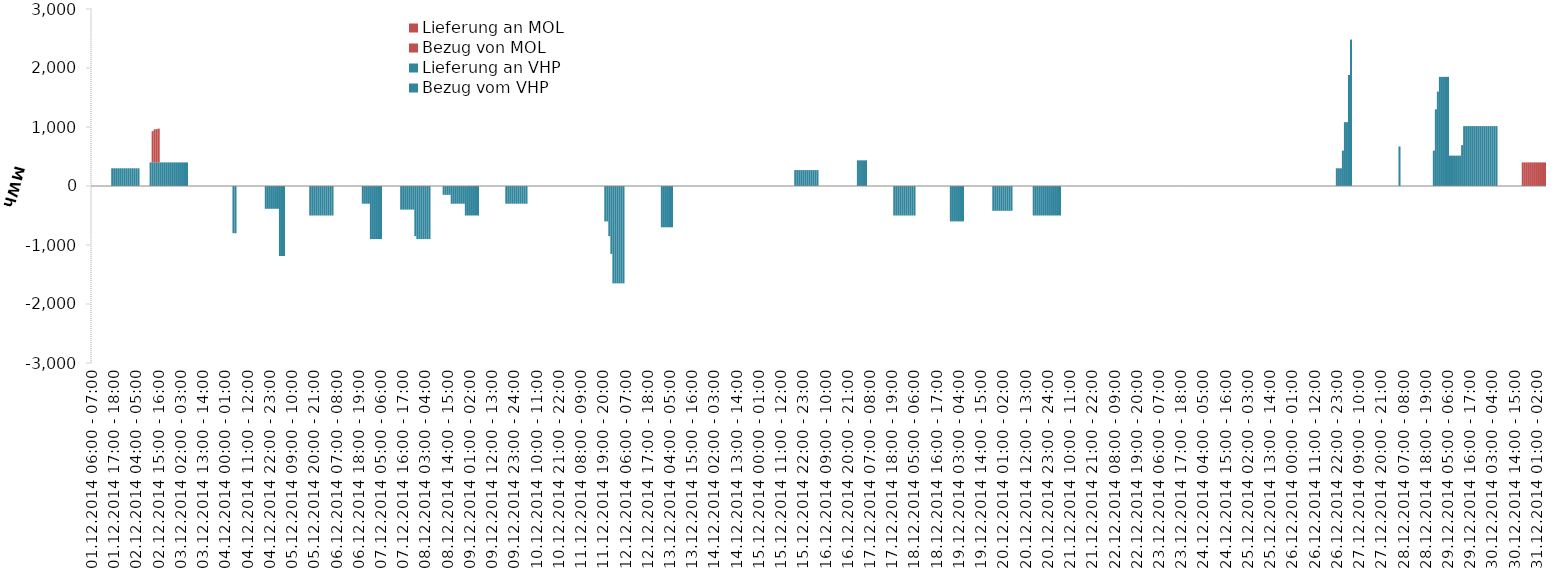
| Category | Bezug vom VHP | Lieferung an VHP | Bezug von MOL | Lieferung an MOL |
|---|---|---|---|---|
| 01.12.2014 06:00 - 07:00 | 0 | 0 | 0 | 0 |
| 01.12.2014 07:00 - 08:00 | 0 | 0 | 0 | 0 |
| 01.12.2014 08:00 - 09:00 | 0 | 0 | 0 | 0 |
| 01.12.2014 09:00 - 10:00 | 0 | 0 | 0 | 0 |
| 01.12.2014 10:00 - 11:00 | 0 | 0 | 0 | 0 |
| 01.12.2014 11:00 - 12:00 | 0 | 0 | 0 | 0 |
| 01.12.2014 12:00 - 13:00 | 0 | 0 | 0 | 0 |
| 01.12.2014 13:00 - 14:00 | 0 | 0 | 0 | 0 |
| 01.12.2014 14:00 - 15:00 | 0 | 0 | 0 | 0 |
| 01.12.2014 15:00 - 16:00 | 0 | 0 | 0 | 0 |
| 01.12.2014 16:00 - 17:00 | 300 | 0 | 0 | 0 |
| 01.12.2014 17:00 - 18:00 | 300 | 0 | 0 | 0 |
| 01.12.2014 18:00 - 19:00 | 300 | 0 | 0 | 0 |
| 01.12.2014 19:00 - 20:00 | 300 | 0 | 0 | 0 |
| 01.12.2014 20:00 - 21:00 | 300 | 0 | 0 | 0 |
| 01.12.2014 21:00 - 22:00 | 300 | 0 | 0 | 0 |
| 01.12.2014 22:00 - 23:00 | 300 | 0 | 0 | 0 |
| 01.12.2014 23:00 - 24:00 | 300 | 0 | 0 | 0 |
| 02.12.2014 00:00 - 01:00 | 300 | 0 | 0 | 0 |
| 02.12.2014 01:00 - 02:00 | 300 | 0 | 0 | 0 |
| 02.12.2014 02:00 - 03:00 | 300 | 0 | 0 | 0 |
| 02.12.2014 03:00 - 04:00 | 300 | 0 | 0 | 0 |
| 02.12.2014 04:00 - 05:00 | 300 | 0 | 0 | 0 |
| 02.12.2014 05:00 - 06:00 | 300 | 0 | 0 | 0 |
| 02.12.2014 06:00 - 07:00 | 0 | 0 | 0 | 0 |
| 02.12.2014 07:00 - 08:00 | 0 | 0 | 0 | 0 |
| 02.12.2014 08:00 - 09:00 | 0 | 0 | 0 | 0 |
| 02.12.2014 09:00 - 10:00 | 0 | 0 | 0 | 0 |
| 02.12.2014 10:00 - 11:00 | 0 | 0 | 0 | 0 |
| 02.12.2014 11:00 - 12:00 | 400 | 0 | 0 | 0 |
| 02.12.2014 12:00 - 13:00 | 400 | 0 | 530 | 0 |
| 02.12.2014 13:00 - 14:00 | 400 | 0 | 560 | 0 |
| 02.12.2014 14:00 - 15:00 | 400 | 0 | 565 | 0 |
| 02.12.2014 15:00 - 16:00 | 400 | 0 | 573 | 0 |
| 02.12.2014 16:00 - 17:00 | 400 | 0 | 0 | 0 |
| 02.12.2014 17:00 - 18:00 | 400 | 0 | 0 | 0 |
| 02.12.2014 18:00 - 19:00 | 400 | 0 | 0 | 0 |
| 02.12.2014 19:00 - 20:00 | 400 | 0 | 0 | 0 |
| 02.12.2014 20:00 - 21:00 | 400 | 0 | 0 | 0 |
| 02.12.2014 21:00 - 22:00 | 400 | 0 | 0 | 0 |
| 02.12.2014 22:00 - 23:00 | 400 | 0 | 0 | 0 |
| 02.12.2014 23:00 - 24:00 | 400 | 0 | 0 | 0 |
| 03.12.2014 00:00 - 01:00 | 400 | 0 | 0 | 0 |
| 03.12.2014 01:00 - 02:00 | 400 | 0 | 0 | 0 |
| 03.12.2014 02:00 - 03:00 | 400 | 0 | 0 | 0 |
| 03.12.2014 03:00 - 04:00 | 400 | 0 | 0 | 0 |
| 03.12.2014 04:00 - 05:00 | 400 | 0 | 0 | 0 |
| 03.12.2014 05:00 - 06:00 | 400 | 0 | 0 | 0 |
| 03.12.2014 06:00 - 07:00 | 0 | 0 | 0 | 0 |
| 03.12.2014 07:00 - 08:00 | 0 | 0 | 0 | 0 |
| 03.12.2014 08:00 - 09:00 | 0 | 0 | 0 | 0 |
| 03.12.2014 09:00 - 10:00 | 0 | 0 | 0 | 0 |
| 03.12.2014 10:00 - 11:00 | 0 | 0 | 0 | 0 |
| 03.12.2014 11:00 - 12:00 | 0 | 0 | 0 | 0 |
| 03.12.2014 12:00 - 13:00 | 0 | 0 | 0 | 0 |
| 03.12.2014 13:00 - 14:00 | 0 | 0 | 0 | 0 |
| 03.12.2014 14:00 - 15:00 | 0 | 0 | 0 | 0 |
| 03.12.2014 15:00 - 16:00 | 0 | 0 | 0 | 0 |
| 03.12.2014 16:00 - 17:00 | 0 | 0 | 0 | 0 |
| 03.12.2014 17:00 - 18:00 | 0 | 0 | 0 | 0 |
| 03.12.2014 18:00 - 19:00 | 0 | 0 | 0 | 0 |
| 03.12.2014 19:00 - 20:00 | 0 | 0 | 0 | 0 |
| 03.12.2014 20:00 - 21:00 | 0 | 0 | 0 | 0 |
| 03.12.2014 21:00 - 22:00 | 0 | 0 | 0 | 0 |
| 03.12.2014 22:00 - 23:00 | 0 | 0 | 0 | 0 |
| 03.12.2014 23:00 - 24:00 | 0 | 0 | 0 | 0 |
| 04.12.2014 00:00 - 01:00 | 0 | 0 | 0 | 0 |
| 04.12.2014 01:00 - 02:00 | 0 | 0 | 0 | 0 |
| 04.12.2014 02:00 - 03:00 | 0 | 0 | 0 | 0 |
| 04.12.2014 03:00 - 04:00 | 0 | 0 | 0 | 0 |
| 04.12.2014 04:00 - 05:00 | 0 | -800 | 0 | 0 |
| 04.12.2014 05:00 - 06:00 | 0 | -800 | 0 | 0 |
| 04.12.2014 06:00 - 07:00 | 0 | 0 | 0 | 0 |
| 04.12.2014 07:00 - 08:00 | 0 | 0 | 0 | 0 |
| 04.12.2014 08:00 - 09:00 | 0 | 0 | 0 | 0 |
| 04.12.2014 09:00 - 10:00 | 0 | 0 | 0 | 0 |
| 04.12.2014 10:00 - 11:00 | 0 | 0 | 0 | 0 |
| 04.12.2014 11:00 - 12:00 | 0 | 0 | 0 | 0 |
| 04.12.2014 12:00 - 13:00 | 0 | 0 | 0 | 0 |
| 04.12.2014 13:00 - 14:00 | 0 | 0 | 0 | 0 |
| 04.12.2014 14:00 - 15:00 | 0 | 0 | 0 | 0 |
| 04.12.2014 15:00 - 16:00 | 0 | 0 | 0 | 0 |
| 04.12.2014 16:00 - 17:00 | 0 | 0 | 0 | 0 |
| 04.12.2014 17:00 - 18:00 | 0 | 0 | 0 | 0 |
| 04.12.2014 18:00 - 19:00 | 0 | 0 | 0 | 0 |
| 04.12.2014 19:00 - 20:00 | 0 | 0 | 0 | 0 |
| 04.12.2014 20:00 - 21:00 | 0 | -386 | 0 | 0 |
| 04.12.2014 21:00 - 22:00 | 0 | -386 | 0 | 0 |
| 04.12.2014 22:00 - 23:00 | 0 | -386 | 0 | 0 |
| 04.12.2014 23:00 - 24:00 | 0 | -386 | 0 | 0 |
| 05.12.2014 00:00 - 01:00 | 0 | -386 | 0 | 0 |
| 05.12.2014 01:00 - 02:00 | 0 | -386 | 0 | 0 |
| 05.12.2014 02:00 - 03:00 | 0 | -386 | 0 | 0 |
| 05.12.2014 03:00 - 04:00 | 0 | -1186 | 0 | 0 |
| 05.12.2014 04:00 - 05:00 | 0 | -1186 | 0 | 0 |
| 05.12.2014 05:00 - 06:00 | 0 | -1186 | 0 | 0 |
| 05.12.2014 06:00 - 07:00 | 0 | 0 | 0 | 0 |
| 05.12.2014 07:00 - 08:00 | 0 | 0 | 0 | 0 |
| 05.12.2014 08:00 - 09:00 | 0 | 0 | 0 | 0 |
| 05.12.2014 09:00 - 10:00 | 0 | 0 | 0 | 0 |
| 05.12.2014 10:00 - 11:00 | 0 | 0 | 0 | 0 |
| 05.12.2014 11:00 - 12:00 | 0 | 0 | 0 | 0 |
| 05.12.2014 12:00 - 13:00 | 0 | 0 | 0 | 0 |
| 05.12.2014 13:00 - 14:00 | 0 | 0 | 0 | 0 |
| 05.12.2014 14:00 - 15:00 | 0 | 0 | 0 | 0 |
| 05.12.2014 15:00 - 16:00 | 0 | 0 | 0 | 0 |
| 05.12.2014 16:00 - 17:00 | 0 | 0 | 0 | 0 |
| 05.12.2014 17:00 - 18:00 | 0 | 0 | 0 | 0 |
| 05.12.2014 18:00 - 19:00 | 0 | -500 | 0 | 0 |
| 05.12.2014 19:00 - 20:00 | 0 | -500 | 0 | 0 |
| 05.12.2014 20:00 - 21:00 | 0 | -500 | 0 | 0 |
| 05.12.2014 21:00 - 22:00 | 0 | -500 | 0 | 0 |
| 05.12.2014 22:00 - 23:00 | 0 | -500 | 0 | 0 |
| 05.12.2014 23:00 - 24:00 | 0 | -500 | 0 | 0 |
| 06.12.2014 00:00 - 01:00 | 0 | -500 | 0 | 0 |
| 06.12.2014 01:00 - 02:00 | 0 | -500 | 0 | 0 |
| 06.12.2014 02:00 - 03:00 | 0 | -500 | 0 | 0 |
| 06.12.2014 03:00 - 04:00 | 0 | -500 | 0 | 0 |
| 06.12.2014 04:00 - 05:00 | 0 | -500 | 0 | 0 |
| 06.12.2014 05:00 - 06:00 | 0 | -500 | 0 | 0 |
| 06.12.2014 06:00 - 07:00 | 0 | 0 | 0 | 0 |
| 06.12.2014 07:00 - 08:00 | 0 | 0 | 0 | 0 |
| 06.12.2014 08:00 - 09:00 | 0 | 0 | 0 | 0 |
| 06.12.2014 09:00 - 10:00 | 0 | 0 | 0 | 0 |
| 06.12.2014 10:00 - 11:00 | 0 | 0 | 0 | 0 |
| 06.12.2014 11:00 - 12:00 | 0 | 0 | 0 | 0 |
| 06.12.2014 12:00 - 13:00 | 0 | 0 | 0 | 0 |
| 06.12.2014 13:00 - 14:00 | 0 | 0 | 0 | 0 |
| 06.12.2014 14:00 - 15:00 | 0 | 0 | 0 | 0 |
| 06.12.2014 15:00 - 16:00 | 0 | 0 | 0 | 0 |
| 06.12.2014 16:00 - 17:00 | 0 | 0 | 0 | 0 |
| 06.12.2014 17:00 - 18:00 | 0 | 0 | 0 | 0 |
| 06.12.2014 18:00 - 19:00 | 0 | 0 | 0 | 0 |
| 06.12.2014 19:00 - 20:00 | 0 | 0 | 0 | 0 |
| 06.12.2014 20:00 - 21:00 | 0 | -300 | 0 | 0 |
| 06.12.2014 21:00 - 22:00 | 0 | -300 | 0 | 0 |
| 06.12.2014 22:00 - 23:00 | 0 | -300 | 0 | 0 |
| 06.12.2014 23:00 - 24:00 | 0 | -300 | 0 | 0 |
| 07.12.2014 00:00 - 01:00 | 0 | -900 | 0 | 0 |
| 07.12.2014 01:00 - 02:00 | 0 | -900 | 0 | 0 |
| 07.12.2014 02:00 - 03:00 | 0 | -900 | 0 | 0 |
| 07.12.2014 03:00 - 04:00 | 0 | -900 | 0 | 0 |
| 07.12.2014 04:00 - 05:00 | 0 | -900 | 0 | 0 |
| 07.12.2014 05:00 - 06:00 | 0 | -900 | 0 | 0 |
| 07.12.2014 06:00 - 07:00 | 0 | 0 | 0 | 0 |
| 07.12.2014 07:00 - 08:00 | 0 | 0 | 0 | 0 |
| 07.12.2014 08:00 - 09:00 | 0 | 0 | 0 | 0 |
| 07.12.2014 09:00 - 10:00 | 0 | 0 | 0 | 0 |
| 07.12.2014 10:00 - 11:00 | 0 | 0 | 0 | 0 |
| 07.12.2014 11:00 - 12:00 | 0 | 0 | 0 | 0 |
| 07.12.2014 12:00 - 13:00 | 0 | 0 | 0 | 0 |
| 07.12.2014 13:00 - 14:00 | 0 | 0 | 0 | 0 |
| 07.12.2014 14:00 - 15:00 | 0 | 0 | 0 | 0 |
| 07.12.2014 15:00 - 16:00 | 0 | -400 | 0 | 0 |
| 07.12.2014 16:00 - 17:00 | 0 | -400 | 0 | 0 |
| 07.12.2014 17:00 - 18:00 | 0 | -400 | 0 | 0 |
| 07.12.2014 18:00 - 19:00 | 0 | -400 | 0 | 0 |
| 07.12.2014 19:00 - 20:00 | 0 | -400 | 0 | 0 |
| 07.12.2014 20:00 - 21:00 | 0 | -400 | 0 | 0 |
| 07.12.2014 21:00 - 22:00 | 0 | -400 | 0 | 0 |
| 07.12.2014 22:00 - 23:00 | 0 | -850 | 0 | 0 |
| 07.12.2014 23:00 - 24:00 | 0 | -900 | 0 | 0 |
| 08.12.2014 00:00 - 01:00 | 0 | -900 | 0 | 0 |
| 08.12.2014 01:00 - 02:00 | 0 | -900 | 0 | 0 |
| 08.12.2014 02:00 - 03:00 | 0 | -900 | 0 | 0 |
| 08.12.2014 03:00 - 04:00 | 0 | -900 | 0 | 0 |
| 08.12.2014 04:00 - 05:00 | 0 | -900 | 0 | 0 |
| 08.12.2014 05:00 - 06:00 | 0 | -900 | 0 | 0 |
| 08.12.2014 06:00 - 07:00 | 0 | 0 | 0 | 0 |
| 08.12.2014 07:00 - 08:00 | 0 | 0 | 0 | 0 |
| 08.12.2014 08:00 - 09:00 | 0 | 0 | 0 | 0 |
| 08.12.2014 09:00 - 10:00 | 0 | 0 | 0 | 0 |
| 08.12.2014 10:00 - 11:00 | 0 | 0 | 0 | 0 |
| 08.12.2014 11:00 - 12:00 | 0 | 0 | 0 | 0 |
| 08.12.2014 12:00 - 13:00 | 0 | -150 | 0 | 0 |
| 08.12.2014 13:00 - 14:00 | 0 | -150 | 0 | 0 |
| 08.12.2014 14:00 - 15:00 | 0 | -150 | 0 | 0 |
| 08.12.2014 15:00 - 16:00 | 0 | -150 | 0 | 0 |
| 08.12.2014 16:00 - 17:00 | 0 | -300 | 0 | 0 |
| 08.12.2014 17:00 - 18:00 | 0 | -300 | 0 | 0 |
| 08.12.2014 18:00 - 19:00 | 0 | -300 | 0 | 0 |
| 08.12.2014 19:00 - 20:00 | 0 | -300 | 0 | 0 |
| 08.12.2014 20:00 - 21:00 | 0 | -300 | 0 | 0 |
| 08.12.2014 21:00 - 22:00 | 0 | -300 | 0 | 0 |
| 08.12.2014 22:00 - 23:00 | 0 | -300 | 0 | 0 |
| 08.12.2014 23:00 - 24:00 | 0 | -500 | 0 | 0 |
| 09.12.2014 00:00 - 01:00 | 0 | -500 | 0 | 0 |
| 09.12.2014 01:00 - 02:00 | 0 | -500 | 0 | 0 |
| 09.12.2014 02:00 - 03:00 | 0 | -500 | 0 | 0 |
| 09.12.2014 03:00 - 04:00 | 0 | -500 | 0 | 0 |
| 09.12.2014 04:00 - 05:00 | 0 | -500 | 0 | 0 |
| 09.12.2014 05:00 - 06:00 | 0 | -500 | 0 | 0 |
| 09.12.2014 06:00 - 07:00 | 0 | 0 | 0 | 0 |
| 09.12.2014 07:00 - 08:00 | 0 | 0 | 0 | 0 |
| 09.12.2014 08:00 - 09:00 | 0 | 0 | 0 | 0 |
| 09.12.2014 09:00 - 10:00 | 0 | 0 | 0 | 0 |
| 09.12.2014 10:00 - 11:00 | 0 | 0 | 0 | 0 |
| 09.12.2014 11:00 - 12:00 | 0 | 0 | 0 | 0 |
| 09.12.2014 12:00 - 13:00 | 0 | 0 | 0 | 0 |
| 09.12.2014 13:00 - 14:00 | 0 | 0 | 0 | 0 |
| 09.12.2014 14:00 - 15:00 | 0 | 0 | 0 | 0 |
| 09.12.2014 15:00 - 16:00 | 0 | 0 | 0 | 0 |
| 09.12.2014 16:00 - 17:00 | 0 | 0 | 0 | 0 |
| 09.12.2014 17:00 - 18:00 | 0 | 0 | 0 | 0 |
| 09.12.2014 18:00 - 19:00 | 0 | 0 | 0 | 0 |
| 09.12.2014 19:00 - 20:00 | 0 | -300 | 0 | 0 |
| 09.12.2014 20:00 - 21:00 | 0 | -300 | 0 | 0 |
| 09.12.2014 21:00 - 22:00 | 0 | -300 | 0 | 0 |
| 09.12.2014 22:00 - 23:00 | 0 | -300 | 0 | 0 |
| 09.12.2014 23:00 - 24:00 | 0 | -300 | 0 | 0 |
| 10.12.2014 00:00 - 01:00 | 0 | -300 | 0 | 0 |
| 10.12.2014 01:00 - 02:00 | 0 | -300 | 0 | 0 |
| 10.12.2014 02:00 - 03:00 | 0 | -300 | 0 | 0 |
| 10.12.2014 03:00 - 04:00 | 0 | -300 | 0 | 0 |
| 10.12.2014 04:00 - 05:00 | 0 | -300 | 0 | 0 |
| 10.12.2014 05:00 - 06:00 | 0 | -300 | 0 | 0 |
| 10.12.2014 06:00 - 07:00 | 0 | 0 | 0 | 0 |
| 10.12.2014 07:00 - 08:00 | 0 | 0 | 0 | 0 |
| 10.12.2014 08:00 - 09:00 | 0 | 0 | 0 | 0 |
| 10.12.2014 09:00 - 10:00 | 0 | 0 | 0 | 0 |
| 10.12.2014 10:00 - 11:00 | 0 | 0 | 0 | 0 |
| 10.12.2014 11:00 - 12:00 | 0 | 0 | 0 | 0 |
| 10.12.2014 12:00 - 13:00 | 0 | 0 | 0 | 0 |
| 10.12.2014 13:00 - 14:00 | 0 | 0 | 0 | 0 |
| 10.12.2014 14:00 - 15:00 | 0 | 0 | 0 | 0 |
| 10.12.2014 15:00 - 16:00 | 0 | 0 | 0 | 0 |
| 10.12.2014 16:00 - 17:00 | 0 | 0 | 0 | 0 |
| 10.12.2014 17:00 - 18:00 | 0 | 0 | 0 | 0 |
| 10.12.2014 18:00 - 19:00 | 0 | 0 | 0 | 0 |
| 10.12.2014 19:00 - 20:00 | 0 | 0 | 0 | 0 |
| 10.12.2014 20:00 - 21:00 | 0 | 0 | 0 | 0 |
| 10.12.2014 21:00 - 22:00 | 0 | 0 | 0 | 0 |
| 10.12.2014 22:00 - 23:00 | 0 | 0 | 0 | 0 |
| 10.12.2014 23:00 - 24:00 | 0 | 0 | 0 | 0 |
| 11.12.2014 00:00 - 01:00 | 0 | 0 | 0 | 0 |
| 11.12.2014 01:00 - 02:00 | 0 | 0 | 0 | 0 |
| 11.12.2014 02:00 - 03:00 | 0 | 0 | 0 | 0 |
| 11.12.2014 03:00 - 04:00 | 0 | 0 | 0 | 0 |
| 11.12.2014 04:00 - 05:00 | 0 | 0 | 0 | 0 |
| 11.12.2014 05:00 - 06:00 | 0 | 0 | 0 | 0 |
| 11.12.2014 06:00 - 07:00 | 0 | 0 | 0 | 0 |
| 11.12.2014 07:00 - 08:00 | 0 | 0 | 0 | 0 |
| 11.12.2014 08:00 - 09:00 | 0 | 0 | 0 | 0 |
| 11.12.2014 09:00 - 10:00 | 0 | 0 | 0 | 0 |
| 11.12.2014 10:00 - 11:00 | 0 | 0 | 0 | 0 |
| 11.12.2014 11:00 - 12:00 | 0 | 0 | 0 | 0 |
| 11.12.2014 12:00 - 13:00 | 0 | 0 | 0 | 0 |
| 11.12.2014 13:00 - 14:00 | 0 | 0 | 0 | 0 |
| 11.12.2014 14:00 - 15:00 | 0 | 0 | 0 | 0 |
| 11.12.2014 15:00 - 16:00 | 0 | 0 | 0 | 0 |
| 11.12.2014 16:00 - 17:00 | 0 | 0 | 0 | 0 |
| 11.12.2014 17:00 - 18:00 | 0 | 0 | 0 | 0 |
| 11.12.2014 18:00 - 19:00 | 0 | 0 | 0 | 0 |
| 11.12.2014 19:00 - 20:00 | 0 | 0 | 0 | 0 |
| 11.12.2014 20:00 - 21:00 | 0 | -600 | 0 | 0 |
| 11.12.2014 21:00 - 22:00 | 0 | -600 | 0 | 0 |
| 11.12.2014 22:00 - 23:00 | 0 | -850 | 0 | 0 |
| 11.12.2014 23:00 - 24:00 | 0 | -1150 | 0 | 0 |
| 12.12.2014 00:00 - 01:00 | 0 | -1650 | 0 | 0 |
| 12.12.2014 01:00 - 02:00 | 0 | -1650 | 0 | 0 |
| 12.12.2014 02:00 - 03:00 | 0 | -1650 | 0 | 0 |
| 12.12.2014 03:00 - 04:00 | 0 | -1650 | 0 | 0 |
| 12.12.2014 04:00 - 05:00 | 0 | -1650 | 0 | 0 |
| 12.12.2014 05:00 - 06:00 | 0 | -1650 | 0 | 0 |
| 12.12.2014 06:00 - 07:00 | 0 | 0 | 0 | 0 |
| 12.12.2014 07:00 - 08:00 | 0 | 0 | 0 | 0 |
| 12.12.2014 08:00 - 09:00 | 0 | 0 | 0 | 0 |
| 12.12.2014 09:00 - 10:00 | 0 | 0 | 0 | 0 |
| 12.12.2014 10:00 - 11:00 | 0 | 0 | 0 | 0 |
| 12.12.2014 11:00 - 12:00 | 0 | 0 | 0 | 0 |
| 12.12.2014 12:00 - 13:00 | 0 | 0 | 0 | 0 |
| 12.12.2014 13:00 - 14:00 | 0 | 0 | 0 | 0 |
| 12.12.2014 14:00 - 15:00 | 0 | 0 | 0 | 0 |
| 12.12.2014 15:00 - 16:00 | 0 | 0 | 0 | 0 |
| 12.12.2014 16:00 - 17:00 | 0 | 0 | 0 | 0 |
| 12.12.2014 17:00 - 18:00 | 0 | 0 | 0 | 0 |
| 12.12.2014 18:00 - 19:00 | 0 | 0 | 0 | 0 |
| 12.12.2014 19:00 - 20:00 | 0 | 0 | 0 | 0 |
| 12.12.2014 20:00 - 21:00 | 0 | 0 | 0 | 0 |
| 12.12.2014 21:00 - 22:00 | 0 | 0 | 0 | 0 |
| 12.12.2014 22:00 - 23:00 | 0 | 0 | 0 | 0 |
| 12.12.2014 23:00 - 24:00 | 0 | 0 | 0 | 0 |
| 13.12.2014 00:00 - 01:00 | 0 | -700 | 0 | 0 |
| 13.12.2014 01:00 - 02:00 | 0 | -700 | 0 | 0 |
| 13.12.2014 02:00 - 03:00 | 0 | -700 | 0 | 0 |
| 13.12.2014 03:00 - 04:00 | 0 | -700 | 0 | 0 |
| 13.12.2014 04:00 - 05:00 | 0 | -700 | 0 | 0 |
| 13.12.2014 05:00 - 06:00 | 0 | -700 | 0 | 0 |
| 13.12.2014 06:00 - 07:00 | 0 | 0 | 0 | 0 |
| 13.12.2014 07:00 - 08:00 | 0 | 0 | 0 | 0 |
| 13.12.2014 08:00 - 09:00 | 0 | 0 | 0 | 0 |
| 13.12.2014 09:00 - 10:00 | 0 | 0 | 0 | 0 |
| 13.12.2014 10:00 - 11:00 | 0 | 0 | 0 | 0 |
| 13.12.2014 11:00 - 12:00 | 0 | 0 | 0 | 0 |
| 13.12.2014 12:00 - 13:00 | 0 | 0 | 0 | 0 |
| 13.12.2014 13:00 - 14:00 | 0 | 0 | 0 | 0 |
| 13.12.2014 14:00 - 15:00 | 0 | 0 | 0 | 0 |
| 13.12.2014 15:00 - 16:00 | 0 | 0 | 0 | 0 |
| 13.12.2014 16:00 - 17:00 | 0 | 0 | 0 | 0 |
| 13.12.2014 17:00 - 18:00 | 0 | 0 | 0 | 0 |
| 13.12.2014 18:00 - 19:00 | 0 | 0 | 0 | 0 |
| 13.12.2014 19:00 - 20:00 | 0 | 0 | 0 | 0 |
| 13.12.2014 20:00 - 21:00 | 0 | 0 | 0 | 0 |
| 13.12.2014 21:00 - 22:00 | 0 | 0 | 0 | 0 |
| 13.12.2014 22:00 - 23:00 | 0 | 0 | 0 | 0 |
| 13.12.2014 23:00 - 24:00 | 0 | 0 | 0 | 0 |
| 14.12.2014 00:00 - 01:00 | 0 | 0 | 0 | 0 |
| 14.12.2014 01:00 - 02:00 | 0 | 0 | 0 | 0 |
| 14.12.2014 02:00 - 03:00 | 0 | 0 | 0 | 0 |
| 14.12.2014 03:00 - 04:00 | 0 | 0 | 0 | 0 |
| 14.12.2014 04:00 - 05:00 | 0 | 0 | 0 | 0 |
| 14.12.2014 05:00 - 06:00 | 0 | 0 | 0 | 0 |
| 14.12.2014 06:00 - 07:00 | 0 | 0 | 0 | 0 |
| 14.12.2014 07:00 - 08:00 | 0 | 0 | 0 | 0 |
| 14.12.2014 08:00 - 09:00 | 0 | 0 | 0 | 0 |
| 14.12.2014 09:00 - 10:00 | 0 | 0 | 0 | 0 |
| 14.12.2014 10:00 - 11:00 | 0 | 0 | 0 | 0 |
| 14.12.2014 11:00 - 12:00 | 0 | 0 | 0 | 0 |
| 14.12.2014 12:00 - 13:00 | 0 | 0 | 0 | 0 |
| 14.12.2014 13:00 - 14:00 | 0 | 0 | 0 | 0 |
| 14.12.2014 14:00 - 15:00 | 0 | 0 | 0 | 0 |
| 14.12.2014 15:00 - 16:00 | 0 | 0 | 0 | 0 |
| 14.12.2014 16:00 - 17:00 | 0 | 0 | 0 | 0 |
| 14.12.2014 17:00 - 18:00 | 0 | 0 | 0 | 0 |
| 14.12.2014 18:00 - 19:00 | 0 | 0 | 0 | 0 |
| 14.12.2014 19:00 - 20:00 | 0 | 0 | 0 | 0 |
| 14.12.2014 20:00 - 21:00 | 0 | 0 | 0 | 0 |
| 14.12.2014 21:00 - 22:00 | 0 | 0 | 0 | 0 |
| 14.12.2014 22:00 - 23:00 | 0 | 0 | 0 | 0 |
| 14.12.2014 23:00 - 24:00 | 0 | 0 | 0 | 0 |
| 15.12.2014 00:00 - 01:00 | 0 | 0 | 0 | 0 |
| 15.12.2014 01:00 - 02:00 | 0 | 0 | 0 | 0 |
| 15.12.2014 02:00 - 03:00 | 0 | 0 | 0 | 0 |
| 15.12.2014 03:00 - 04:00 | 0 | 0 | 0 | 0 |
| 15.12.2014 04:00 - 05:00 | 0 | 0 | 0 | 0 |
| 15.12.2014 05:00 - 06:00 | 0 | 0 | 0 | 0 |
| 15.12.2014 06:00 - 07:00 | 0 | 0 | 0 | 0 |
| 15.12.2014 07:00 - 08:00 | 0 | 0 | 0 | 0 |
| 15.12.2014 08:00 - 09:00 | 0 | 0 | 0 | 0 |
| 15.12.2014 09:00 - 10:00 | 0 | 0 | 0 | 0 |
| 15.12.2014 10:00 - 11:00 | 0 | 0 | 0 | 0 |
| 15.12.2014 11:00 - 12:00 | 0 | 0 | 0 | 0 |
| 15.12.2014 12:00 - 13:00 | 0 | 0 | 0 | 0 |
| 15.12.2014 13:00 - 14:00 | 0 | 0 | 0 | 0 |
| 15.12.2014 14:00 - 15:00 | 0 | 0 | 0 | 0 |
| 15.12.2014 15:00 - 16:00 | 0 | 0 | 0 | 0 |
| 15.12.2014 16:00 - 17:00 | 0 | 0 | 0 | 0 |
| 15.12.2014 17:00 - 18:00 | 0 | 0 | 0 | 0 |
| 15.12.2014 18:00 - 19:00 | 270 | 0 | 0 | 0 |
| 15.12.2014 19:00 - 20:00 | 270 | 0 | 0 | 0 |
| 15.12.2014 20:00 - 21:00 | 270 | 0 | 0 | 0 |
| 15.12.2014 21:00 - 22:00 | 270 | 0 | 0 | 0 |
| 15.12.2014 22:00 - 23:00 | 270 | 0 | 0 | 0 |
| 15.12.2014 23:00 - 24:00 | 270 | 0 | 0 | 0 |
| 16.12.2014 00:00 - 01:00 | 270 | 0 | 0 | 0 |
| 16.12.2014 01:00 - 02:00 | 270 | 0 | 0 | 0 |
| 16.12.2014 02:00 - 03:00 | 270 | 0 | 0 | 0 |
| 16.12.2014 03:00 - 04:00 | 270 | 0 | 0 | 0 |
| 16.12.2014 04:00 - 05:00 | 270 | 0 | 0 | 0 |
| 16.12.2014 05:00 - 06:00 | 270 | 0 | 0 | 0 |
| 16.12.2014 06:00 - 07:00 | 0 | 0 | 0 | 0 |
| 16.12.2014 07:00 - 08:00 | 0 | 0 | 0 | 0 |
| 16.12.2014 08:00 - 09:00 | 0 | 0 | 0 | 0 |
| 16.12.2014 09:00 - 10:00 | 0 | 0 | 0 | 0 |
| 16.12.2014 10:00 - 11:00 | 0 | 0 | 0 | 0 |
| 16.12.2014 11:00 - 12:00 | 0 | 0 | 0 | 0 |
| 16.12.2014 12:00 - 13:00 | 0 | 0 | 0 | 0 |
| 16.12.2014 13:00 - 14:00 | 0 | 0 | 0 | 0 |
| 16.12.2014 14:00 - 15:00 | 0 | 0 | 0 | 0 |
| 16.12.2014 15:00 - 16:00 | 0 | 0 | 0 | 0 |
| 16.12.2014 16:00 - 17:00 | 0 | 0 | 0 | 0 |
| 16.12.2014 17:00 - 18:00 | 0 | 0 | 0 | 0 |
| 16.12.2014 18:00 - 19:00 | 0 | 0 | 0 | 0 |
| 16.12.2014 19:00 - 20:00 | 0 | 0 | 0 | 0 |
| 16.12.2014 20:00 - 21:00 | 0 | 0 | 0 | 0 |
| 16.12.2014 21:00 - 22:00 | 0 | 0 | 0 | 0 |
| 16.12.2014 22:00 - 23:00 | 0 | 0 | 0 | 0 |
| 16.12.2014 23:00 - 24:00 | 0 | 0 | 0 | 0 |
| 17.12.2014 00:00 - 01:00 | 0 | 0 | 0 | 0 |
| 17.12.2014 01:00 - 02:00 | 435 | 0 | 0 | 0 |
| 17.12.2014 02:00 - 03:00 | 435 | 0 | 0 | 0 |
| 17.12.2014 03:00 - 04:00 | 435 | 0 | 0 | 0 |
| 17.12.2014 04:00 - 05:00 | 435 | 0 | 0 | 0 |
| 17.12.2014 05:00 - 06:00 | 435 | 0 | 0 | 0 |
| 17.12.2014 06:00 - 07:00 | 0 | 0 | 0 | 0 |
| 17.12.2014 07:00 - 08:00 | 0 | 0 | 0 | 0 |
| 17.12.2014 08:00 - 09:00 | 0 | 0 | 0 | 0 |
| 17.12.2014 09:00 - 10:00 | 0 | 0 | 0 | 0 |
| 17.12.2014 10:00 - 11:00 | 0 | 0 | 0 | 0 |
| 17.12.2014 11:00 - 12:00 | 0 | 0 | 0 | 0 |
| 17.12.2014 12:00 - 13:00 | 0 | 0 | 0 | 0 |
| 17.12.2014 13:00 - 14:00 | 0 | 0 | 0 | 0 |
| 17.12.2014 14:00 - 15:00 | 0 | 0 | 0 | 0 |
| 17.12.2014 15:00 - 16:00 | 0 | 0 | 0 | 0 |
| 17.12.2014 16:00 - 17:00 | 0 | 0 | 0 | 0 |
| 17.12.2014 17:00 - 18:00 | 0 | 0 | 0 | 0 |
| 17.12.2014 18:00 - 19:00 | 0 | 0 | 0 | 0 |
| 17.12.2014 19:00 - 20:00 | 0 | -500 | 0 | 0 |
| 17.12.2014 20:00 - 21:00 | 0 | -500 | 0 | 0 |
| 17.12.2014 21:00 - 22:00 | 0 | -500 | 0 | 0 |
| 17.12.2014 22:00 - 23:00 | 0 | -500 | 0 | 0 |
| 17.12.2014 23:00 - 24:00 | 0 | -500 | 0 | 0 |
| 18.12.2014 00:00 - 01:00 | 0 | -500 | 0 | 0 |
| 18.12.2014 01:00 - 02:00 | 0 | -500 | 0 | 0 |
| 18.12.2014 02:00 - 03:00 | 0 | -500 | 0 | 0 |
| 18.12.2014 03:00 - 04:00 | 0 | -500 | 0 | 0 |
| 18.12.2014 04:00 - 05:00 | 0 | -500 | 0 | 0 |
| 18.12.2014 05:00 - 06:00 | 0 | -500 | 0 | 0 |
| 18.12.2014 06:00 - 07:00 | 0 | 0 | 0 | 0 |
| 18.12.2014 07:00 - 08:00 | 0 | 0 | 0 | 0 |
| 18.12.2014 08:00 - 09:00 | 0 | 0 | 0 | 0 |
| 18.12.2014 09:00 - 10:00 | 0 | 0 | 0 | 0 |
| 18.12.2014 10:00 - 11:00 | 0 | 0 | 0 | 0 |
| 18.12.2014 11:00 - 12:00 | 0 | 0 | 0 | 0 |
| 18.12.2014 12:00 - 13:00 | 0 | 0 | 0 | 0 |
| 18.12.2014 13:00 - 14:00 | 0 | 0 | 0 | 0 |
| 18.12.2014 14:00 - 15:00 | 0 | 0 | 0 | 0 |
| 18.12.2014 15:00 - 16:00 | 0 | 0 | 0 | 0 |
| 18.12.2014 16:00 - 17:00 | 0 | 0 | 0 | 0 |
| 18.12.2014 17:00 - 18:00 | 0 | 0 | 0 | 0 |
| 18.12.2014 18:00 - 19:00 | 0 | 0 | 0 | 0 |
| 18.12.2014 19:00 - 20:00 | 0 | 0 | 0 | 0 |
| 18.12.2014 20:00 - 21:00 | 0 | 0 | 0 | 0 |
| 18.12.2014 21:00 - 22:00 | 0 | 0 | 0 | 0 |
| 18.12.2014 22:00 - 23:00 | 0 | 0 | 0 | 0 |
| 18.12.2014 23:00 - 24:00 | 0 | -600 | 0 | 0 |
| 19.12.2014 00:00 - 01:00 | 0 | -600 | 0 | 0 |
| 19.12.2014 01:00 - 02:00 | 0 | -600 | 0 | 0 |
| 19.12.2014 02:00 - 03:00 | 0 | -600 | 0 | 0 |
| 19.12.2014 03:00 - 04:00 | 0 | -600 | 0 | 0 |
| 19.12.2014 04:00 - 05:00 | 0 | -600 | 0 | 0 |
| 19.12.2014 05:00 - 06:00 | 0 | -600 | 0 | 0 |
| 19.12.2014 06:00 - 07:00 | 0 | 0 | 0 | 0 |
| 19.12.2014 07:00 - 08:00 | 0 | 0 | 0 | 0 |
| 19.12.2014 08:00 - 09:00 | 0 | 0 | 0 | 0 |
| 19.12.2014 09:00 - 10:00 | 0 | 0 | 0 | 0 |
| 19.12.2014 10:00 - 11:00 | 0 | 0 | 0 | 0 |
| 19.12.2014 11:00 - 12:00 | 0 | 0 | 0 | 0 |
| 19.12.2014 12:00 - 13:00 | 0 | 0 | 0 | 0 |
| 19.12.2014 13:00 - 14:00 | 0 | 0 | 0 | 0 |
| 19.12.2014 14:00 - 15:00 | 0 | 0 | 0 | 0 |
| 19.12.2014 15:00 - 16:00 | 0 | 0 | 0 | 0 |
| 19.12.2014 16:00 - 17:00 | 0 | 0 | 0 | 0 |
| 19.12.2014 17:00 - 18:00 | 0 | 0 | 0 | 0 |
| 19.12.2014 18:00 - 19:00 | 0 | 0 | 0 | 0 |
| 19.12.2014 19:00 - 20:00 | 0 | 0 | 0 | 0 |
| 19.12.2014 20:00 - 21:00 | 0 | -420 | 0 | 0 |
| 19.12.2014 21:00 - 22:00 | 0 | -420 | 0 | 0 |
| 19.12.2014 22:00 - 23:00 | 0 | -420 | 0 | 0 |
| 19.12.2014 23:00 - 24:00 | 0 | -420 | 0 | 0 |
| 20.12.2014 00:00 - 01:00 | 0 | -420 | 0 | 0 |
| 20.12.2014 01:00 - 02:00 | 0 | -420 | 0 | 0 |
| 20.12.2014 02:00 - 03:00 | 0 | -420 | 0 | 0 |
| 20.12.2014 03:00 - 04:00 | 0 | -420 | 0 | 0 |
| 20.12.2014 04:00 - 05:00 | 0 | -420 | 0 | 0 |
| 20.12.2014 05:00 - 06:00 | 0 | -420 | 0 | 0 |
| 20.12.2014 06:00 - 07:00 | 0 | 0 | 0 | 0 |
| 20.12.2014 07:00 - 08:00 | 0 | 0 | 0 | 0 |
| 20.12.2014 08:00 - 09:00 | 0 | 0 | 0 | 0 |
| 20.12.2014 09:00 - 10:00 | 0 | 0 | 0 | 0 |
| 20.12.2014 10:00 - 11:00 | 0 | 0 | 0 | 0 |
| 20.12.2014 11:00 - 12:00 | 0 | 0 | 0 | 0 |
| 20.12.2014 12:00 - 13:00 | 0 | 0 | 0 | 0 |
| 20.12.2014 13:00 - 14:00 | 0 | 0 | 0 | 0 |
| 20.12.2014 14:00 - 15:00 | 0 | 0 | 0 | 0 |
| 20.12.2014 15:00 - 16:00 | 0 | 0 | 0 | 0 |
| 20.12.2014 16:00 - 17:00 | 0 | -500 | 0 | 0 |
| 20.12.2014 17:00 - 18:00 | 0 | -500 | 0 | 0 |
| 20.12.2014 18:00 - 19:00 | 0 | -500 | 0 | 0 |
| 20.12.2014 19:00 - 20:00 | 0 | -500 | 0 | 0 |
| 20.12.2014 20:00 - 21:00 | 0 | -500 | 0 | 0 |
| 20.12.2014 21:00 - 22:00 | 0 | -500 | 0 | 0 |
| 20.12.2014 22:00 - 23:00 | 0 | -500 | 0 | 0 |
| 20.12.2014 23:00 - 24:00 | 0 | -500 | 0 | 0 |
| 21.12.2014 00:00 - 01:00 | 0 | -500 | 0 | 0 |
| 21.12.2014 01:00 - 02:00 | 0 | -500 | 0 | 0 |
| 21.12.2014 02:00 - 03:00 | 0 | -500 | 0 | 0 |
| 21.12.2014 03:00 - 04:00 | 0 | -500 | 0 | 0 |
| 21.12.2014 04:00 - 05:00 | 0 | -500 | 0 | 0 |
| 21.12.2014 05:00 - 06:00 | 0 | -500 | 0 | 0 |
| 21.12.2014 06:00 - 07:00 | 0 | 0 | 0 | 0 |
| 21.12.2014 07:00 - 08:00 | 0 | 0 | 0 | 0 |
| 21.12.2014 08:00 - 09:00 | 0 | 0 | 0 | 0 |
| 21.12.2014 09:00 - 10:00 | 0 | 0 | 0 | 0 |
| 21.12.2014 10:00 - 11:00 | 0 | 0 | 0 | 0 |
| 21.12.2014 11:00 - 12:00 | 0 | 0 | 0 | 0 |
| 21.12.2014 12:00 - 13:00 | 0 | 0 | 0 | 0 |
| 21.12.2014 13:00 - 14:00 | 0 | 0 | 0 | 0 |
| 21.12.2014 14:00 - 15:00 | 0 | 0 | 0 | 0 |
| 21.12.2014 15:00 - 16:00 | 0 | 0 | 0 | 0 |
| 21.12.2014 16:00 - 17:00 | 0 | 0 | 0 | 0 |
| 21.12.2014 17:00 - 18:00 | 0 | 0 | 0 | 0 |
| 21.12.2014 18:00 - 19:00 | 0 | 0 | 0 | 0 |
| 21.12.2014 19:00 - 20:00 | 0 | 0 | 0 | 0 |
| 21.12.2014 20:00 - 21:00 | 0 | 0 | 0 | 0 |
| 21.12.2014 21:00 - 22:00 | 0 | 0 | 0 | 0 |
| 21.12.2014 22:00 - 23:00 | 0 | 0 | 0 | 0 |
| 21.12.2014 23:00 - 24:00 | 0 | 0 | 0 | 0 |
| 22.12.2014 00:00 - 01:00 | 0 | 0 | 0 | 0 |
| 22.12.2014 01:00 - 02:00 | 0 | 0 | 0 | 0 |
| 22.12.2014 02:00 - 03:00 | 0 | 0 | 0 | 0 |
| 22.12.2014 03:00 - 04:00 | 0 | 0 | 0 | 0 |
| 22.12.2014 04:00 - 05:00 | 0 | 0 | 0 | 0 |
| 22.12.2014 05:00 - 06:00 | 0 | 0 | 0 | 0 |
| 22.12.2014 06:00 - 07:00 | 0 | 0 | 0 | 0 |
| 22.12.2014 07:00 - 08:00 | 0 | 0 | 0 | 0 |
| 22.12.2014 08:00 - 09:00 | 0 | 0 | 0 | 0 |
| 22.12.2014 09:00 - 10:00 | 0 | 0 | 0 | 0 |
| 22.12.2014 10:00 - 11:00 | 0 | 0 | 0 | 0 |
| 22.12.2014 11:00 - 12:00 | 0 | 0 | 0 | 0 |
| 22.12.2014 12:00 - 13:00 | 0 | 0 | 0 | 0 |
| 22.12.2014 13:00 - 14:00 | 0 | 0 | 0 | 0 |
| 22.12.2014 14:00 - 15:00 | 0 | 0 | 0 | 0 |
| 22.12.2014 15:00 - 16:00 | 0 | 0 | 0 | 0 |
| 22.12.2014 16:00 - 17:00 | 0 | 0 | 0 | 0 |
| 22.12.2014 17:00 - 18:00 | 0 | 0 | 0 | 0 |
| 22.12.2014 18:00 - 19:00 | 0 | 0 | 0 | 0 |
| 22.12.2014 19:00 - 20:00 | 0 | 0 | 0 | 0 |
| 22.12.2014 20:00 - 21:00 | 0 | 0 | 0 | 0 |
| 22.12.2014 21:00 - 22:00 | 0 | 0 | 0 | 0 |
| 22.12.2014 22:00 - 23:00 | 0 | 0 | 0 | 0 |
| 22.12.2014 23:00 - 24:00 | 0 | 0 | 0 | 0 |
| 23.12.2014 00:00 - 01:00 | 0 | 0 | 0 | 0 |
| 23.12.2014 01:00 - 02:00 | 0 | 0 | 0 | 0 |
| 23.12.2014 02:00 - 03:00 | 0 | 0 | 0 | 0 |
| 23.12.2014 03:00 - 04:00 | 0 | 0 | 0 | 0 |
| 23.12.2014 04:00 - 05:00 | 0 | 0 | 0 | 0 |
| 23.12.2014 05:00 - 06:00 | 0 | 0 | 0 | 0 |
| 23.12.2014 06:00 - 07:00 | 0 | 0 | 0 | 0 |
| 23.12.2014 07:00 - 08:00 | 0 | 0 | 0 | 0 |
| 23.12.2014 08:00 - 09:00 | 0 | 0 | 0 | 0 |
| 23.12.2014 09:00 - 10:00 | 0 | 0 | 0 | 0 |
| 23.12.2014 10:00 - 11:00 | 0 | 0 | 0 | 0 |
| 23.12.2014 11:00 - 12:00 | 0 | 0 | 0 | 0 |
| 23.12.2014 12:00 - 13:00 | 0 | 0 | 0 | 0 |
| 23.12.2014 13:00 - 14:00 | 0 | 0 | 0 | 0 |
| 23.12.2014 14:00 - 15:00 | 0 | 0 | 0 | 0 |
| 23.12.2014 15:00 - 16:00 | 0 | 0 | 0 | 0 |
| 23.12.2014 16:00 - 17:00 | 0 | 0 | 0 | 0 |
| 23.12.2014 17:00 - 18:00 | 0 | 0 | 0 | 0 |
| 23.12.2014 18:00 - 19:00 | 0 | 0 | 0 | 0 |
| 23.12.2014 19:00 - 20:00 | 0 | 0 | 0 | 0 |
| 23.12.2014 20:00 - 21:00 | 0 | 0 | 0 | 0 |
| 23.12.2014 21:00 - 22:00 | 0 | 0 | 0 | 0 |
| 23.12.2014 22:00 - 23:00 | 0 | 0 | 0 | 0 |
| 23.12.2014 23:00 - 24:00 | 0 | 0 | 0 | 0 |
| 24.12.2014 00:00 - 01:00 | 0 | 0 | 0 | 0 |
| 24.12.2014 01:00 - 02:00 | 0 | 0 | 0 | 0 |
| 24.12.2014 02:00 - 03:00 | 0 | 0 | 0 | 0 |
| 24.12.2014 03:00 - 04:00 | 0 | 0 | 0 | 0 |
| 24.12.2014 04:00 - 05:00 | 0 | 0 | 0 | 0 |
| 24.12.2014 05:00 - 06:00 | 0 | 0 | 0 | 0 |
| 24.12.2014 06:00 - 07:00 | 0 | 0 | 0 | 0 |
| 24.12.2014 07:00 - 08:00 | 0 | 0 | 0 | 0 |
| 24.12.2014 08:00 - 09:00 | 0 | 0 | 0 | 0 |
| 24.12.2014 09:00 - 10:00 | 0 | 0 | 0 | 0 |
| 24.12.2014 10:00 - 11:00 | 0 | 0 | 0 | 0 |
| 24.12.2014 11:00 - 12:00 | 0 | 0 | 0 | 0 |
| 24.12.2014 12:00 - 13:00 | 0 | 0 | 0 | 0 |
| 24.12.2014 13:00 - 14:00 | 0 | 0 | 0 | 0 |
| 24.12.2014 14:00 - 15:00 | 0 | 0 | 0 | 0 |
| 24.12.2014 15:00 - 16:00 | 0 | 0 | 0 | 0 |
| 24.12.2014 16:00 - 17:00 | 0 | 0 | 0 | 0 |
| 24.12.2014 17:00 - 18:00 | 0 | 0 | 0 | 0 |
| 24.12.2014 18:00 - 19:00 | 0 | 0 | 0 | 0 |
| 24.12.2014 19:00 - 20:00 | 0 | 0 | 0 | 0 |
| 24.12.2014 20:00 - 21:00 | 0 | 0 | 0 | 0 |
| 24.12.2014 21:00 - 22:00 | 0 | 0 | 0 | 0 |
| 24.12.2014 22:00 - 23:00 | 0 | 0 | 0 | 0 |
| 24.12.2014 23:00 - 24:00 | 0 | 0 | 0 | 0 |
| 25.12.2014 00:00 - 01:00 | 0 | 0 | 0 | 0 |
| 25.12.2014 01:00 - 02:00 | 0 | 0 | 0 | 0 |
| 25.12.2014 02:00 - 03:00 | 0 | 0 | 0 | 0 |
| 25.12.2014 03:00 - 04:00 | 0 | 0 | 0 | 0 |
| 25.12.2014 04:00 - 05:00 | 0 | 0 | 0 | 0 |
| 25.12.2014 05:00 - 06:00 | 0 | 0 | 0 | 0 |
| 25.12.2014 06:00 - 07:00 | 0 | 0 | 0 | 0 |
| 25.12.2014 07:00 - 08:00 | 0 | 0 | 0 | 0 |
| 25.12.2014 08:00 - 09:00 | 0 | 0 | 0 | 0 |
| 25.12.2014 09:00 - 10:00 | 0 | 0 | 0 | 0 |
| 25.12.2014 10:00 - 11:00 | 0 | 0 | 0 | 0 |
| 25.12.2014 11:00 - 12:00 | 0 | 0 | 0 | 0 |
| 25.12.2014 12:00 - 13:00 | 0 | 0 | 0 | 0 |
| 25.12.2014 13:00 - 14:00 | 0 | 0 | 0 | 0 |
| 25.12.2014 14:00 - 15:00 | 0 | 0 | 0 | 0 |
| 25.12.2014 15:00 - 16:00 | 0 | 0 | 0 | 0 |
| 25.12.2014 16:00 - 17:00 | 0 | 0 | 0 | 0 |
| 25.12.2014 17:00 - 18:00 | 0 | 0 | 0 | 0 |
| 25.12.2014 18:00 - 19:00 | 0 | 0 | 0 | 0 |
| 25.12.2014 19:00 - 20:00 | 0 | 0 | 0 | 0 |
| 25.12.2014 20:00 - 21:00 | 0 | 0 | 0 | 0 |
| 25.12.2014 21:00 - 22:00 | 0 | 0 | 0 | 0 |
| 25.12.2014 22:00 - 23:00 | 0 | 0 | 0 | 0 |
| 25.12.2014 23:00 - 24:00 | 0 | 0 | 0 | 0 |
| 26.12.2014 00:00 - 01:00 | 0 | 0 | 0 | 0 |
| 26.12.2014 01:00 - 02:00 | 0 | 0 | 0 | 0 |
| 26.12.2014 02:00 - 03:00 | 0 | 0 | 0 | 0 |
| 26.12.2014 03:00 - 04:00 | 0 | 0 | 0 | 0 |
| 26.12.2014 04:00 - 05:00 | 0 | 0 | 0 | 0 |
| 26.12.2014 05:00 - 06:00 | 0 | 0 | 0 | 0 |
| 26.12.2014 06:00 - 07:00 | 0 | 0 | 0 | 0 |
| 26.12.2014 07:00 - 08:00 | 0 | 0 | 0 | 0 |
| 26.12.2014 08:00 - 09:00 | 0 | 0 | 0 | 0 |
| 26.12.2014 09:00 - 10:00 | 0 | 0 | 0 | 0 |
| 26.12.2014 10:00 - 11:00 | 0 | 0 | 0 | 0 |
| 26.12.2014 11:00 - 12:00 | 0 | 0 | 0 | 0 |
| 26.12.2014 12:00 - 13:00 | 0 | 0 | 0 | 0 |
| 26.12.2014 13:00 - 14:00 | 0 | 0 | 0 | 0 |
| 26.12.2014 14:00 - 15:00 | 0 | 0 | 0 | 0 |
| 26.12.2014 15:00 - 16:00 | 0 | 0 | 0 | 0 |
| 26.12.2014 16:00 - 17:00 | 0 | 0 | 0 | 0 |
| 26.12.2014 17:00 - 18:00 | 0 | 0 | 0 | 0 |
| 26.12.2014 18:00 - 19:00 | 0 | 0 | 0 | 0 |
| 26.12.2014 19:00 - 20:00 | 0 | 0 | 0 | 0 |
| 26.12.2014 20:00 - 21:00 | 0 | 0 | 0 | 0 |
| 26.12.2014 21:00 - 22:00 | 0 | 0 | 0 | 0 |
| 26.12.2014 22:00 - 23:00 | 300 | 0 | 0 | 0 |
| 26.12.2014 23:00 - 24:00 | 300 | 0 | 0 | 0 |
| 27.12.2014 00:00 - 01:00 | 300 | 0 | 0 | 0 |
| 27.12.2014 01:00 - 02:00 | 600 | 0 | 0 | 0 |
| 27.12.2014 02:00 - 03:00 | 1082 | 0 | 0 | 0 |
| 27.12.2014 03:00 - 04:00 | 1082 | 0 | 0 | 0 |
| 27.12.2014 04:00 - 05:00 | 1882 | 0 | 0 | 0 |
| 27.12.2014 05:00 - 06:00 | 2482 | 0 | 0 | 0 |
| 27.12.2014 06:00 - 07:00 | 0 | 0 | 0 | 0 |
| 27.12.2014 07:00 - 08:00 | 0 | 0 | 0 | 0 |
| 27.12.2014 08:00 - 09:00 | 0 | 0 | 0 | 0 |
| 27.12.2014 09:00 - 10:00 | 0 | 0 | 0 | 0 |
| 27.12.2014 10:00 - 11:00 | 0 | 0 | 0 | 0 |
| 27.12.2014 11:00 - 12:00 | 0 | 0 | 0 | 0 |
| 27.12.2014 12:00 - 13:00 | 0 | 0 | 0 | 0 |
| 27.12.2014 13:00 - 14:00 | 0 | 0 | 0 | 0 |
| 27.12.2014 14:00 - 15:00 | 0 | 0 | 0 | 0 |
| 27.12.2014 15:00 - 16:00 | 0 | 0 | 0 | 0 |
| 27.12.2014 16:00 - 17:00 | 0 | 0 | 0 | 0 |
| 27.12.2014 17:00 - 18:00 | 0 | 0 | 0 | 0 |
| 27.12.2014 18:00 - 19:00 | 0 | 0 | 0 | 0 |
| 27.12.2014 19:00 - 20:00 | 0 | 0 | 0 | 0 |
| 27.12.2014 20:00 - 21:00 | 0 | 0 | 0 | 0 |
| 27.12.2014 21:00 - 22:00 | 0 | 0 | 0 | 0 |
| 27.12.2014 22:00 - 23:00 | 0 | 0 | 0 | 0 |
| 27.12.2014 23:00 - 24:00 | 0 | 0 | 0 | 0 |
| 28.12.2014 00:00 - 01:00 | 0 | 0 | 0 | 0 |
| 28.12.2014 01:00 - 02:00 | 0 | 0 | 0 | 0 |
| 28.12.2014 02:00 - 03:00 | 0 | 0 | 0 | 0 |
| 28.12.2014 03:00 - 04:00 | 0 | 0 | 0 | 0 |
| 28.12.2014 04:00 - 05:00 | 0 | 0 | 0 | 0 |
| 28.12.2014 05:00 - 06:00 | 670 | 0 | 0 | 0 |
| 28.12.2014 06:00 - 07:00 | 0 | 0 | 0 | 0 |
| 28.12.2014 07:00 - 08:00 | 0 | 0 | 0 | 0 |
| 28.12.2014 08:00 - 09:00 | 0 | 0 | 0 | 0 |
| 28.12.2014 09:00 - 10:00 | 0 | 0 | 0 | 0 |
| 28.12.2014 10:00 - 11:00 | 0 | 0 | 0 | 0 |
| 28.12.2014 11:00 - 12:00 | 0 | 0 | 0 | 0 |
| 28.12.2014 12:00 - 13:00 | 0 | 0 | 0 | 0 |
| 28.12.2014 13:00 - 14:00 | 0 | 0 | 0 | 0 |
| 28.12.2014 14:00 - 15:00 | 0 | 0 | 0 | 0 |
| 28.12.2014 15:00 - 16:00 | 0 | 0 | 0 | 0 |
| 28.12.2014 16:00 - 17:00 | 0 | 0 | 0 | 0 |
| 28.12.2014 17:00 - 18:00 | 0 | 0 | 0 | 0 |
| 28.12.2014 18:00 - 19:00 | 0 | 0 | 0 | 0 |
| 28.12.2014 19:00 - 20:00 | 0 | 0 | 0 | 0 |
| 28.12.2014 20:00 - 21:00 | 0 | 0 | 0 | 0 |
| 28.12.2014 21:00 - 22:00 | 0 | 0 | 0 | 0 |
| 28.12.2014 22:00 - 23:00 | 600 | 0 | 0 | 0 |
| 28.12.2014 23:00 - 24:00 | 1300 | 0 | 0 | 0 |
| 29.12.2014 00:00 - 01:00 | 1600 | 0 | 0 | 0 |
| 29.12.2014 01:00 - 02:00 | 1850 | 0 | 0 | 0 |
| 29.12.2014 02:00 - 03:00 | 1850 | 0 | 0 | 0 |
| 29.12.2014 03:00 - 04:00 | 1850 | 0 | 0 | 0 |
| 29.12.2014 04:00 - 05:00 | 1850 | 0 | 0 | 0 |
| 29.12.2014 05:00 - 06:00 | 1850 | 0 | 0 | 0 |
| 29.12.2014 06:00 - 07:00 | 515 | 0 | 0 | 0 |
| 29.12.2014 07:00 - 08:00 | 515 | 0 | 0 | 0 |
| 29.12.2014 08:00 - 09:00 | 515 | 0 | 0 | 0 |
| 29.12.2014 09:00 - 10:00 | 515 | 0 | 0 | 0 |
| 29.12.2014 10:00 - 11:00 | 515 | 0 | 0 | 0 |
| 29.12.2014 11:00 - 12:00 | 515 | 0 | 0 | 0 |
| 29.12.2014 12:00 - 13:00 | 692 | 0 | 0 | 0 |
| 29.12.2014 13:00 - 14:00 | 1015 | 0 | 0 | 0 |
| 29.12.2014 14:00 - 15:00 | 1015 | 0 | 0 | 0 |
| 29.12.2014 15:00 - 16:00 | 1015 | 0 | 0 | 0 |
| 29.12.2014 16:00 - 17:00 | 1015 | 0 | 0 | 0 |
| 29.12.2014 17:00 - 18:00 | 1015 | 0 | 0 | 0 |
| 29.12.2014 18:00 - 19:00 | 1015 | 0 | 0 | 0 |
| 29.12.2014 19:00 - 20:00 | 1015 | 0 | 0 | 0 |
| 29.12.2014 20:00 - 21:00 | 1015 | 0 | 0 | 0 |
| 29.12.2014 21:00 - 22:00 | 1015 | 0 | 0 | 0 |
| 29.12.2014 22:00 - 23:00 | 1015 | 0 | 0 | 0 |
| 29.12.2014 23:00 - 24:00 | 1015 | 0 | 0 | 0 |
| 30.12.2014 00:00 - 01:00 | 1015 | 0 | 0 | 0 |
| 30.12.2014 01:00 - 02:00 | 1015 | 0 | 0 | 0 |
| 30.12.2014 02:00 - 03:00 | 1015 | 0 | 0 | 0 |
| 30.12.2014 03:00 - 04:00 | 1015 | 0 | 0 | 0 |
| 30.12.2014 04:00 - 05:00 | 1015 | 0 | 0 | 0 |
| 30.12.2014 05:00 - 06:00 | 1015 | 0 | 0 | 0 |
| 30.12.2014 06:00 - 07:00 | 0 | 0 | 0 | 0 |
| 30.12.2014 07:00 - 08:00 | 0 | 0 | 0 | 0 |
| 30.12.2014 08:00 - 09:00 | 0 | 0 | 0 | 0 |
| 30.12.2014 09:00 - 10:00 | 0 | 0 | 0 | 0 |
| 30.12.2014 10:00 - 11:00 | 0 | 0 | 0 | 0 |
| 30.12.2014 11:00 - 12:00 | 0 | 0 | 0 | 0 |
| 30.12.2014 12:00 - 13:00 | 0 | 0 | 0 | 0 |
| 30.12.2014 13:00 - 14:00 | 0 | 0 | 0 | 0 |
| 30.12.2014 14:00 - 15:00 | 0 | 0 | 0 | 0 |
| 30.12.2014 15:00 - 16:00 | 0 | 0 | 0 | 0 |
| 30.12.2014 16:00 - 17:00 | 0 | 0 | 0 | 0 |
| 30.12.2014 17:00 - 18:00 | 0 | 0 | 0 | 0 |
| 30.12.2014 18:00 - 19:00 | 0 | 0 | 400 | 0 |
| 30.12.2014 19:00 - 20:00 | 0 | 0 | 400 | 0 |
| 30.12.2014 20:00 - 21:00 | 0 | 0 | 400 | 0 |
| 30.12.2014 21:00 - 22:00 | 0 | 0 | 400 | 0 |
| 30.12.2014 22:00 - 23:00 | 0 | 0 | 400 | 0 |
| 30.12.2014 23:00 - 24:00 | 0 | 0 | 400 | 0 |
| 31.12.2014 00:00 - 01:00 | 0 | 0 | 400 | 0 |
| 31.12.2014 01:00 - 02:00 | 0 | 0 | 400 | 0 |
| 31.12.2014 02:00 - 03:00 | 0 | 0 | 400 | 0 |
| 31.12.2014 03:00 - 04:00 | 0 | 0 | 400 | 0 |
| 31.12.2014 04:00 - 05:00 | 0 | 0 | 400 | 0 |
| 31.12.2014 05:00 - 06:00 | 0 | 0 | 400 | 0 |